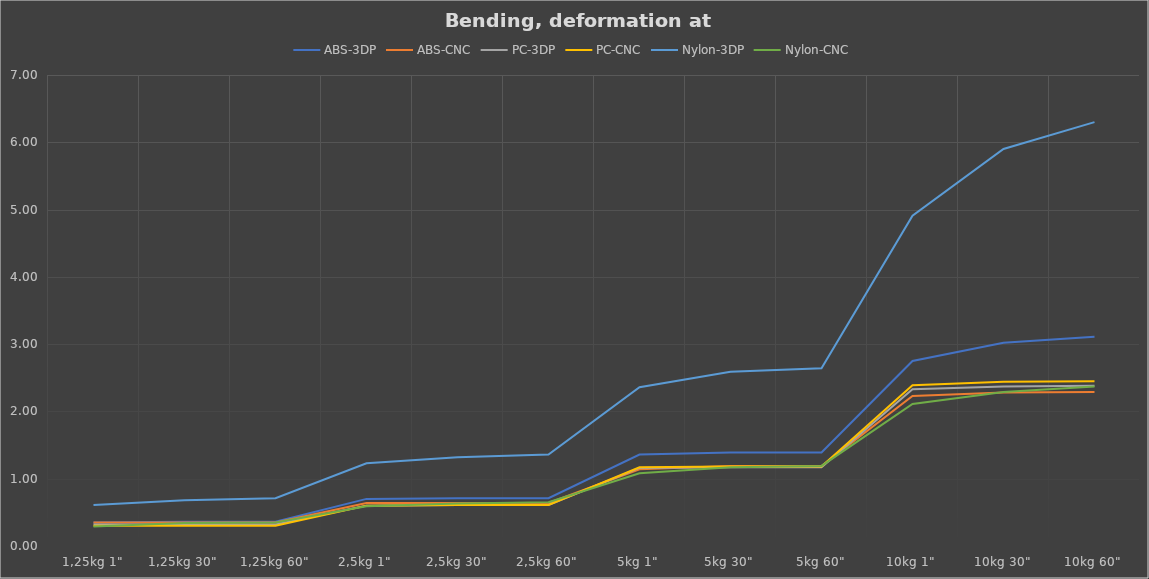
| Category | ABS-3DP | ABS-CNC | PC-3DP | PC-CNC | Nylon-3DP | Nylon-CNC |
|---|---|---|---|---|---|---|
| 1,25kg 1" | 0.35 | 0.35 | 0.32 | 0.3 | 0.61 | 0.29 |
| 1,25kg 30" | 0.36 | 0.35 | 0.32 | 0.3 | 0.68 | 0.34 |
| 1,25kg 60" | 0.36 | 0.35 | 0.32 | 0.3 | 0.71 | 0.35 |
| 2,5kg 1" | 0.7 | 0.64 | 0.6 | 0.6 | 1.23 | 0.59 |
| 2,5kg 30" | 0.71 | 0.64 | 0.61 | 0.61 | 1.32 | 0.63 |
| 2,5kg 60" | 0.71 | 0.64 | 0.61 | 0.61 | 1.36 | 0.65 |
| 5kg 1" | 1.36 | 1.14 | 1.16 | 1.17 | 2.36 | 1.08 |
| 5kg 30" | 1.39 | 1.19 | 1.17 | 1.18 | 2.59 | 1.17 |
| 5kg 60" | 1.39 | 1.19 | 1.17 | 1.18 | 2.64 | 1.19 |
| 10kg 1" | 2.75 | 2.23 | 2.33 | 2.39 | 4.91 | 2.11 |
| 10kg 30" | 3.02 | 2.28 | 2.37 | 2.44 | 5.9 | 2.29 |
| 10kg 60" | 3.11 | 2.29 | 2.38 | 2.45 | 6.3 | 2.37 |